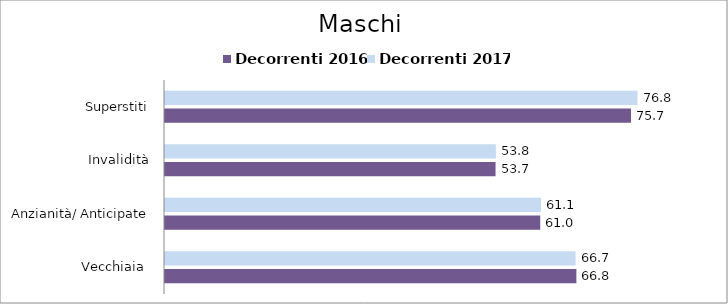
| Category | Decorrenti 2016 | Decorrenti 2017 |
|---|---|---|
| Vecchiaia  | 66.83 | 66.7 |
| Anzianità/ Anticipate | 60.96 | 61.09 |
| Invalidità | 53.7 | 53.75 |
| Superstiti | 75.71 | 76.76 |